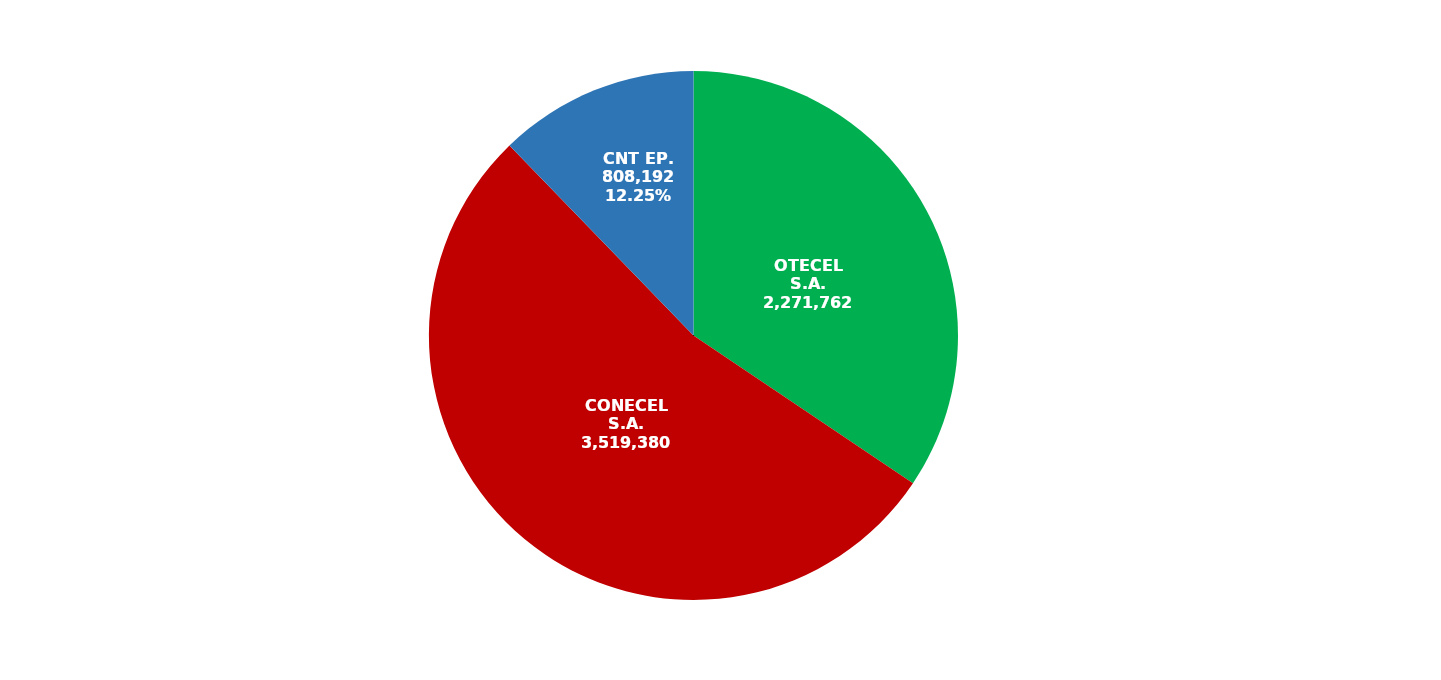
| Category | Series 0 |
|---|---|
| OTECEL S.A. | 2271762 |
| CONECEL S.A. | 3519380 |
| CNT EP. | 808192 |